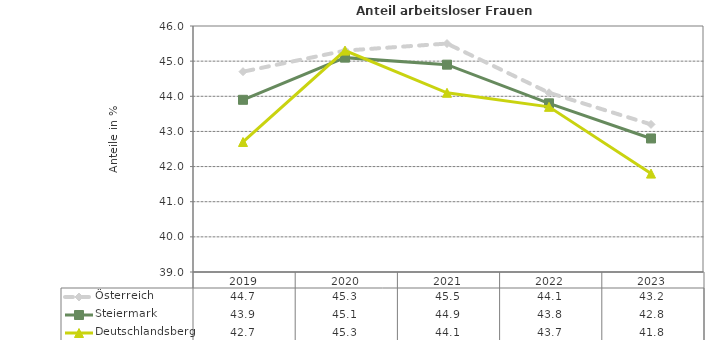
| Category | Österreich | Steiermark | Deutschlandsberg |
|---|---|---|---|
| 2023.0 | 43.2 | 42.8 | 41.8 |
| 2022.0 | 44.1 | 43.8 | 43.7 |
| 2021.0 | 45.5 | 44.9 | 44.1 |
| 2020.0 | 45.3 | 45.1 | 45.3 |
| 2019.0 | 44.7 | 43.9 | 42.7 |